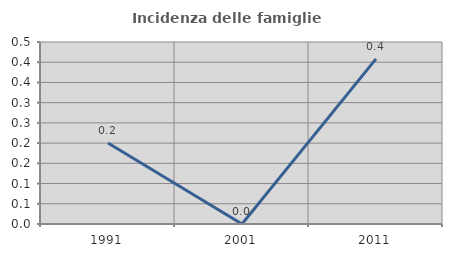
| Category | Incidenza delle famiglie numerose |
|---|---|
| 1991.0 | 0.2 |
| 2001.0 | 0 |
| 2011.0 | 0.408 |